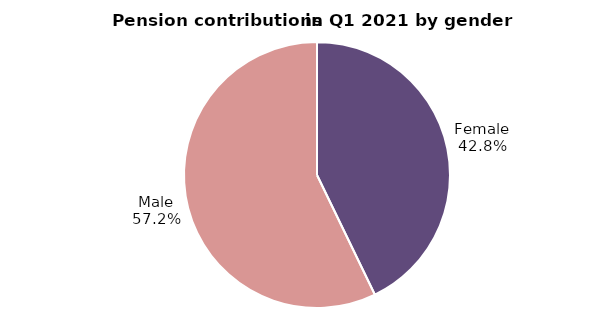
| Category | Series 0 |
|---|---|
| Female | 20629035.32 |
| Male | 27539068.29 |